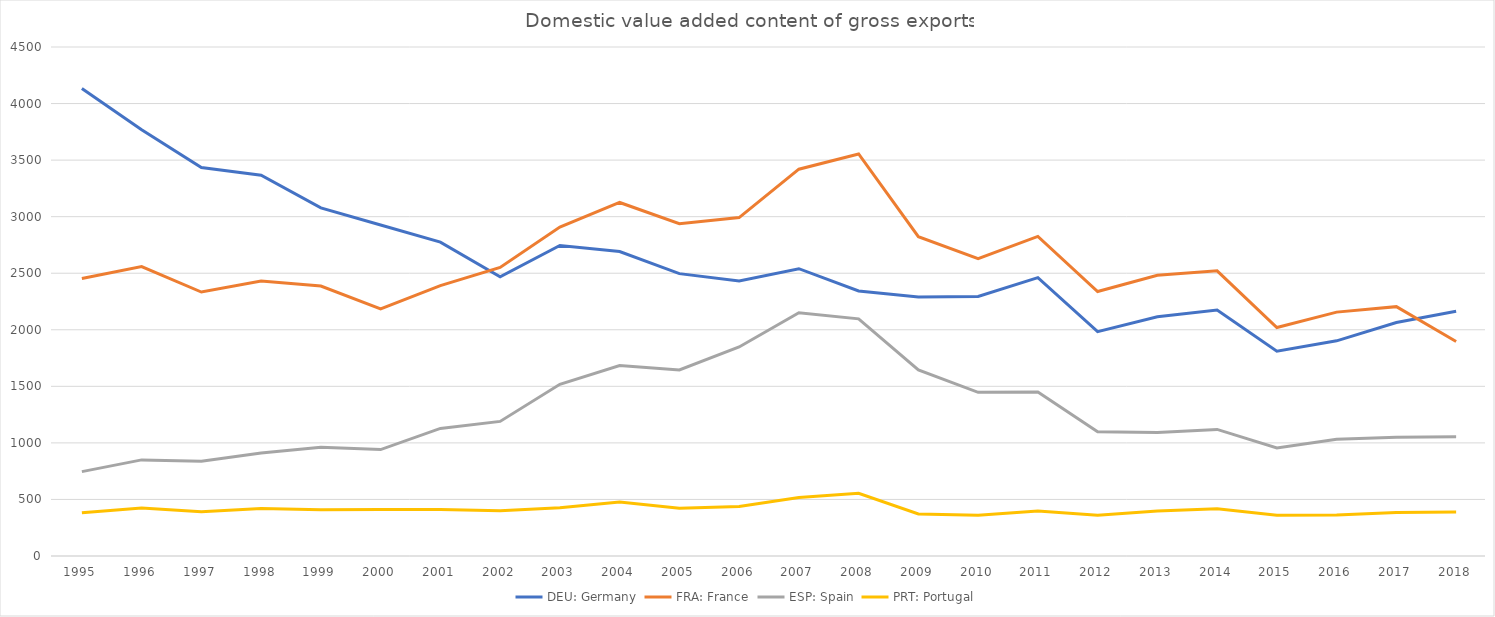
| Category | DEU: Germany | FRA: France | ESP: Spain | PRT: Portugal |
|---|---|---|---|---|
| 1995.0 | 4133.5 | 2453.8 | 745.8 | 383.4 |
| 1996.0 | 3768.7 | 2559.3 | 849.6 | 425.1 |
| 1997.0 | 3434.6 | 2333.4 | 837.1 | 391.2 |
| 1998.0 | 3366.8 | 2431.3 | 910 | 420.7 |
| 1999.0 | 3078 | 2386.7 | 962.4 | 409 |
| 2000.0 | 2926.6 | 2184.8 | 940.9 | 410.5 |
| 2001.0 | 2775.1 | 2390.6 | 1127.6 | 410.5 |
| 2002.0 | 2468.2 | 2551.7 | 1189.8 | 400.3 |
| 2003.0 | 2745.4 | 2908.6 | 1517.9 | 425.8 |
| 2004.0 | 2691.9 | 3125.5 | 1683.4 | 476.3 |
| 2005.0 | 2496.2 | 2937.2 | 1645.5 | 422.3 |
| 2006.0 | 2431.3 | 2991.9 | 1848.1 | 438.1 |
| 2007.0 | 2540 | 3419.8 | 2150.3 | 516.8 |
| 2008.0 | 2343.3 | 3554.4 | 2096.8 | 554.8 |
| 2009.0 | 2289.8 | 2823.4 | 1645.7 | 372 |
| 2010.0 | 2294.4 | 2628.6 | 1447.3 | 361 |
| 2011.0 | 2460.9 | 2825.8 | 1449.6 | 398.1 |
| 2012.0 | 1983 | 2338.6 | 1098.6 | 361.3 |
| 2013.0 | 2115.2 | 2482.5 | 1092.1 | 397 |
| 2014.0 | 2174.4 | 2520.8 | 1119 | 417.4 |
| 2015.0 | 1809.8 | 2020.3 | 955.5 | 359.7 |
| 2016.0 | 1902.2 | 2156.2 | 1033 | 363.3 |
| 2017.0 | 2064.6 | 2204.4 | 1050 | 384.9 |
| 2018.0 | 2163.8 | 1896.9 | 1054.4 | 388.7 |